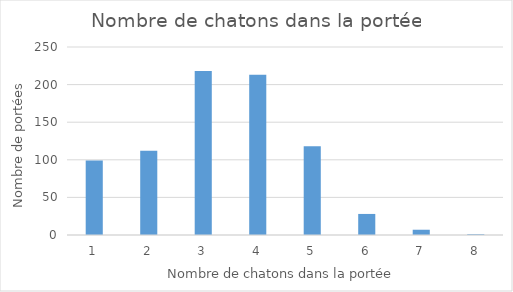
| Category | Series 0 |
|---|---|
| 1.0 | 99 |
| 2.0 | 112 |
| 3.0 | 218 |
| 4.0 | 213 |
| 5.0 | 118 |
| 6.0 | 28 |
| 7.0 | 7 |
| 8.0 | 1 |